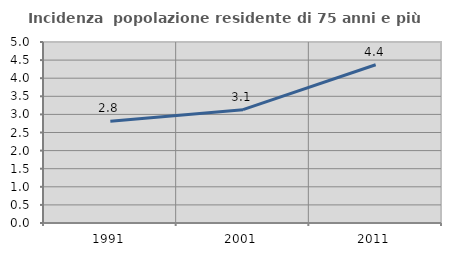
| Category | Incidenza  popolazione residente di 75 anni e più |
|---|---|
| 1991.0 | 2.812 |
| 2001.0 | 3.131 |
| 2011.0 | 4.372 |